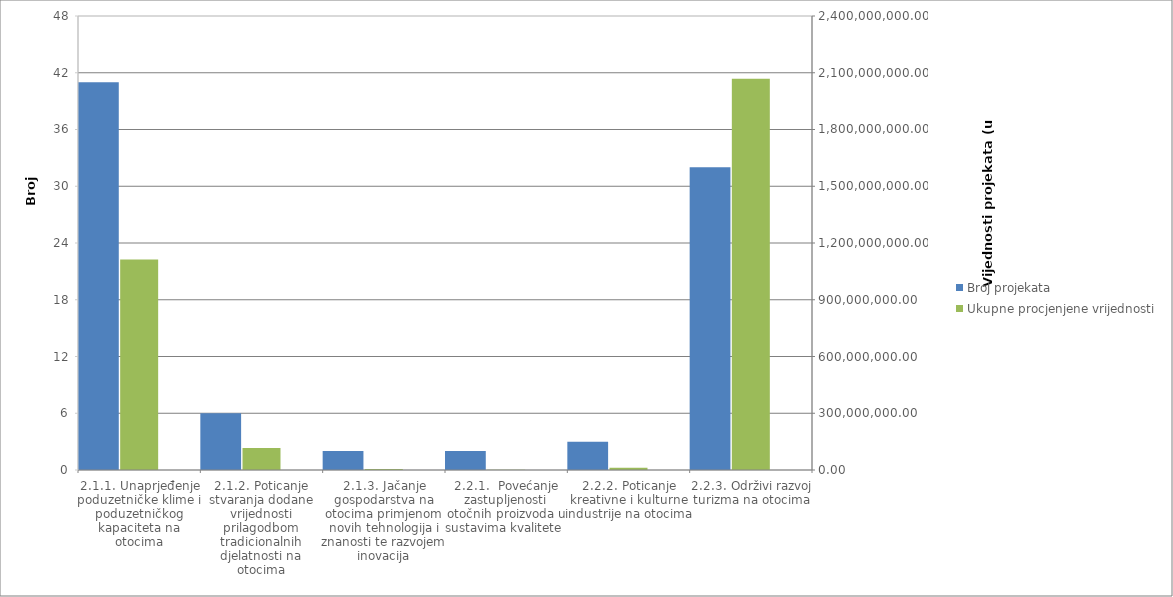
| Category | Broj projekata | Series 1 |
|---|---|---|
| 2.1.1. Unaprjeđenje poduzetničke klime i poduzetničkog kapaciteta na otocima | 41 |  |
| 2.1.2. Poticanje stvaranja dodane vrijednosti prilagodbom tradicionalnih djelatnosti na otocima | 6 |  |
| 2.1.3. Jačanje gospodarstva na otocima primjenom novih tehnologija i znanosti te razvojem inovacija | 2 |  |
| 2.2.1.  Povećanje zastupljenosti otočnih proizvoda u sustavima kvalitete  | 2 |  |
| 2.2.2. Poticanje kreativne i kulturne industrije na otocima | 3 |  |
| 2.2.3. Održivi razvoj turizma na otocima | 32 |  |